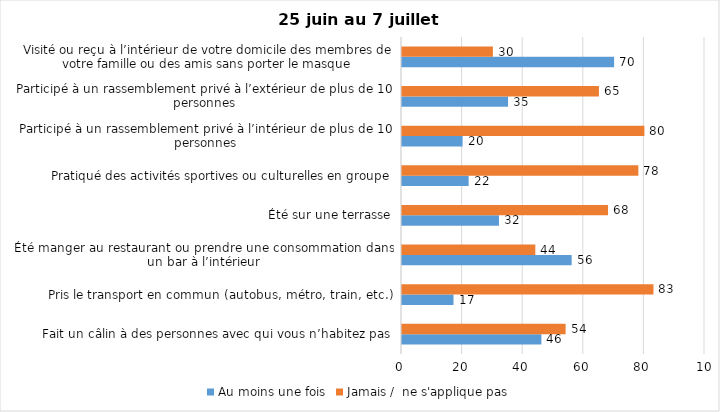
| Category | Au moins une fois | Jamais /  ne s'applique pas |
|---|---|---|
| Fait un câlin à des personnes avec qui vous n’habitez pas | 46 | 54 |
| Pris le transport en commun (autobus, métro, train, etc.) | 17 | 83 |
| Été manger au restaurant ou prendre une consommation dans un bar à l’intérieur | 56 | 44 |
| Été sur une terrasse | 32 | 68 |
| Pratiqué des activités sportives ou culturelles en groupe | 22 | 78 |
| Participé à un rassemblement privé à l’intérieur de plus de 10 personnes | 20 | 80 |
| Participé à un rassemblement privé à l’extérieur de plus de 10 personnes | 35 | 65 |
| Visité ou reçu à l’intérieur de votre domicile des membres de votre famille ou des amis sans porter le masque | 70 | 30 |